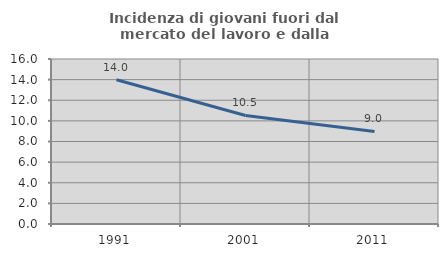
| Category | Incidenza di giovani fuori dal mercato del lavoro e dalla formazione  |
|---|---|
| 1991.0 | 13.986 |
| 2001.0 | 10.526 |
| 2011.0 | 8.974 |